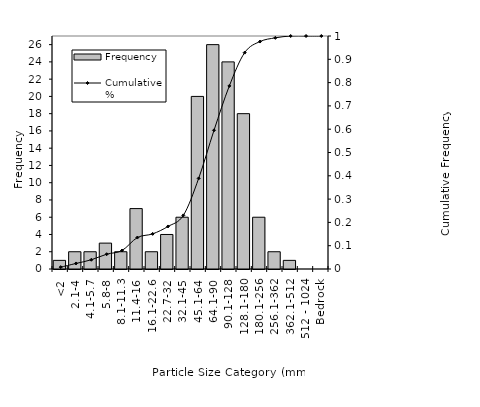
| Category | Frequency |
|---|---|
| <2 | 1 |
| 2.1-4 | 2 |
| 4.1-5.7 | 2 |
| 5.8-8 | 3 |
| 8.1-11.3 | 2 |
| 11.4-16 | 7 |
| 16.1-22.6 | 2 |
| 22.7-32 | 4 |
| 32.1-45 | 6 |
| 45.1-64 | 20 |
| 64.1-90 | 26 |
| 90.1-128 | 24 |
| 128.1-180 | 18 |
| 180.1-256 | 6 |
| 256.1-362 | 2 |
| 362.1-512 | 1 |
| 512 - 1024 | 0 |
| Bedrock | 0 |